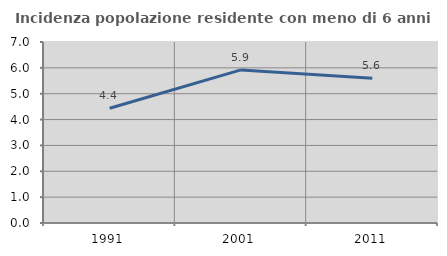
| Category | Incidenza popolazione residente con meno di 6 anni |
|---|---|
| 1991.0 | 4.437 |
| 2001.0 | 5.92 |
| 2011.0 | 5.594 |